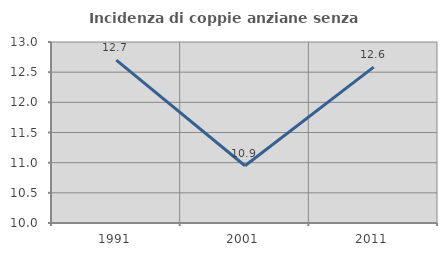
| Category | Incidenza di coppie anziane senza figli  |
|---|---|
| 1991.0 | 12.698 |
| 2001.0 | 10.949 |
| 2011.0 | 12.583 |